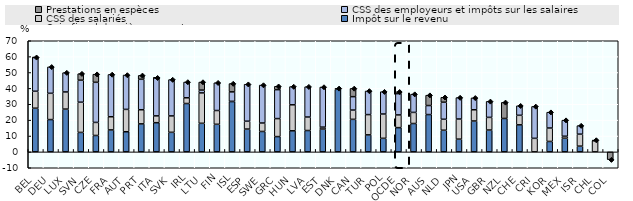
| Category | Impôt sur le revenu | CSS des salariés | CSS des employeurs et impôts sur les salaires | Prestations en espèces |
|---|---|---|---|---|
| BEL | 27.518 | 10.664 | 21.289 | 0.099 |
| DEU | 20.349 | 16.56 | 16.662 | 0 |
| LUX | 26.939 | 10.816 | 12.157 | 0 |
| SVN | 12.261 | 19.035 | 13.867 | 4.097 |
| CZE | 10.34 | 8.221 | 25.262 | 5.118 |
| FRA | 13.834 | 8.298 | 26.63 | 0 |
| AUT | 12.683 | 14.082 | 21.666 | 0 |
| PRT | 17.647 | 8.889 | 19.192 | 2.461 |
| ITA | 18.392 | 4.289 | 24.001 | 0.02 |
| SVK | 12.319 | 10.332 | 22.899 | 0 |
| IRL | 30.468 | 3.602 | 9.95 | 0 |
| LTU | 17.992 | 19.157 | 1.759 | 5.083 |
| FIN | 17.375 | 8.681 | 17.492 | 0 |
| ISL | 31.717 | 0.117 | 5.971 | 5.231 |
| ESP | 14.366 | 4.946 | 23.313 | 0 |
| SWE | 12.863 | 5.323 | 23.908 | 0 |
| GRC | 9.632 | 11.342 | 18.227 | 2.123 |
| HUN | 13.274 | 16.372 | 11.504 | 0 |
| LVA | 13.461 | 8.494 | 19.103 | 0 |
| EST | 14.39 | 1.196 | 25.262 | 0 |
| DNK | 39.394 | 0 | 0.611 | 0 |
| CAN | 20.494 | 5.849 | 8.445 | 5.18 |
| TUR | 10.72 | 12.766 | 14.894 | 0 |
| POL | 8.538 | 15.32 | 14.06 | 0 |
| OCDE | 15.266 | 8.021 | 13.388 | 1.178 |
| NOR | 17.873 | 6.991 | 11.504 | 0 |
| AUS | 23.51 | 0 | 5.68 | 6.535 |
| NLD | 13.634 | 6.916 | 10.729 | 3.102 |
| JPN | 8.028 | 12.672 | 13.502 | 0 |
| USA | 19.453 | 7.075 | 7.517 | 0 |
| GBR | 13.765 | 7.977 | 10.067 | 0 |
| NZL | 21.053 | 0 | 0 | 10.134 |
| CHE | 17.035 | 6.015 | 6.015 | 0 |
| CRI | 0 | 8.524 | 20.109 | 0 |
| KOR | 6.569 | 8.462 | 9.974 | 0 |
| MEX | 8.606 | 1.247 | 10.128 | 0 |
| ISR | 3.606 | 7.556 | 5.381 | 0 |
| CHL | 0 | 7 | 0 | 0.449 |
| COL | 0 | 0 | 0 | -4.884 |